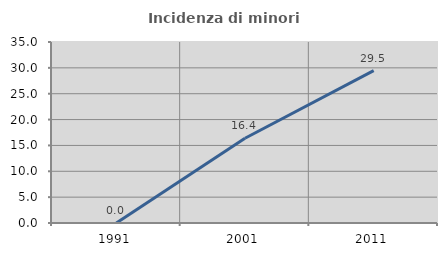
| Category | Incidenza di minori stranieri |
|---|---|
| 1991.0 | 0 |
| 2001.0 | 16.393 |
| 2011.0 | 29.455 |